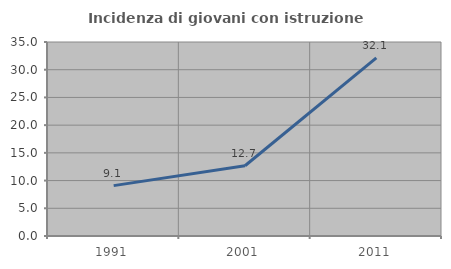
| Category | Incidenza di giovani con istruzione universitaria |
|---|---|
| 1991.0 | 9.091 |
| 2001.0 | 12.676 |
| 2011.0 | 32.143 |